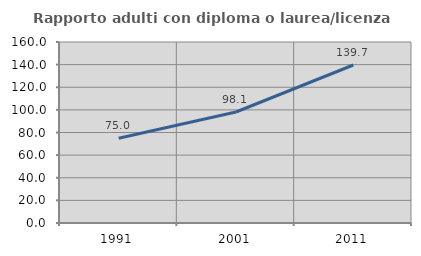
| Category | Rapporto adulti con diploma o laurea/licenza media  |
|---|---|
| 1991.0 | 74.975 |
| 2001.0 | 98.131 |
| 2011.0 | 139.674 |